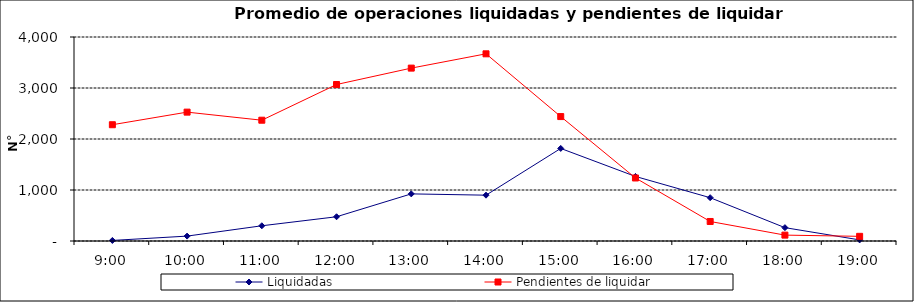
| Category | Liquidadas | Pendientes de liquidar |
|---|---|---|
| 0.375 | 10.81 | 2280 |
| 0.4166666666666667 | 96 | 2526.905 |
| 0.4583333333333333 | 298.571 | 2368.476 |
| 0.5 | 475.238 | 3068.333 |
| 0.5416666666666666 | 923.762 | 3389.905 |
| 0.5833333333333334 | 898.429 | 3670.048 |
| 0.625 | 1815.238 | 2439.714 |
| 0.6666666666666666 | 1265.667 | 1235.857 |
| 0.7083333333333334 | 849.048 | 382.762 |
| 0.75 | 261.714 | 115.286 |
| 0.7916666666666666 | 21.524 | 91.476 |